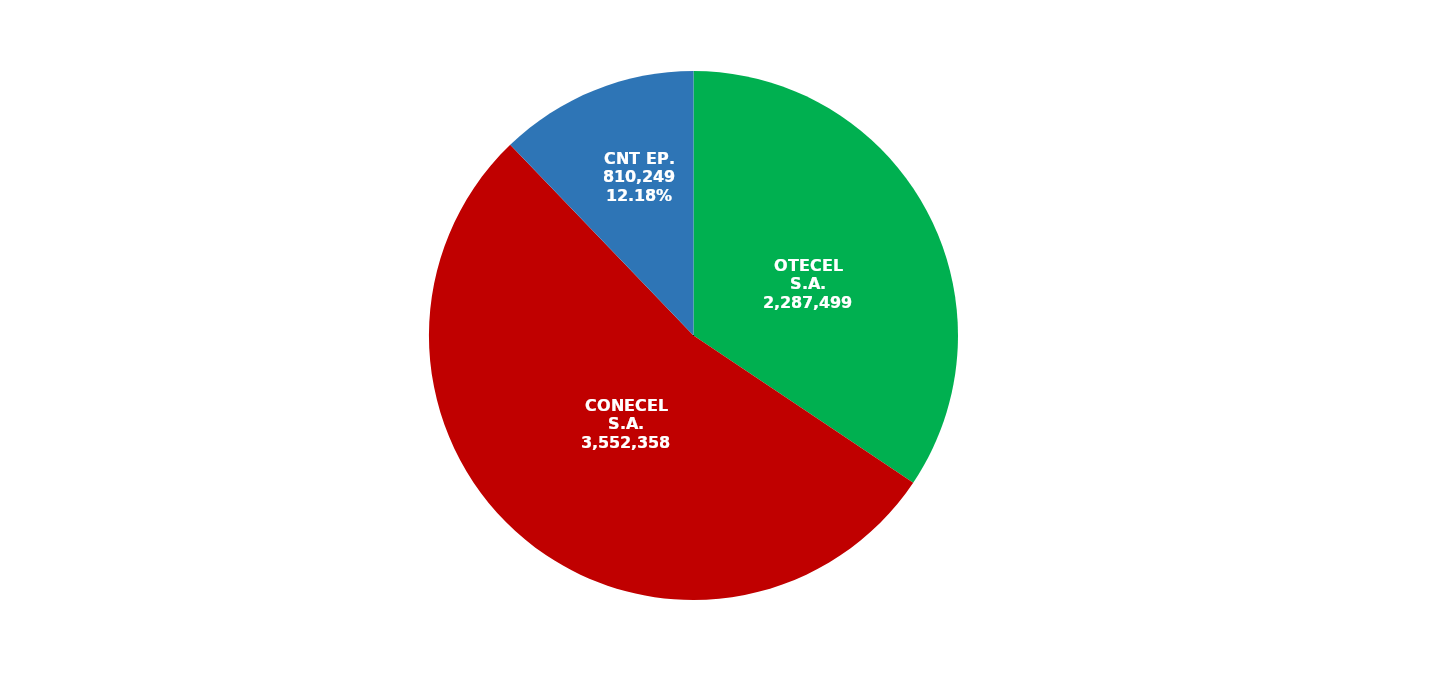
| Category | Series 0 |
|---|---|
| OTECEL S.A. | 2287499 |
| CONECEL S.A. | 3552358 |
| CNT EP. | 810249 |